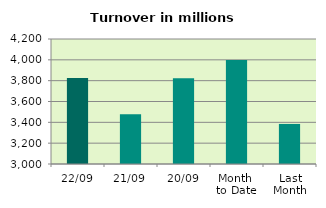
| Category | Series 0 |
|---|---|
| 22/09 | 3824.4 |
| 21/09 | 3476.81 |
| 20/09 | 3822.4 |
| Month 
to Date | 3997.763 |
| Last
Month | 3384.596 |